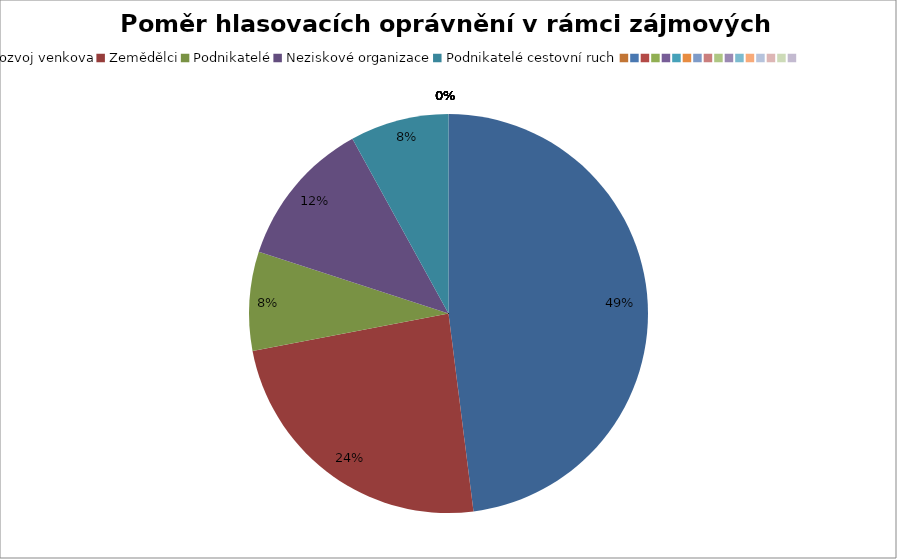
| Category | Series 0 |
|---|---|
| Rozvoj venkova | 0.48 |
| Zemědělci | 0.24 |
| Podnikatelé | 0.08 |
| Neziskové organizace | 0.12 |
| Podnikatelé cestovní ruch | 0.08 |